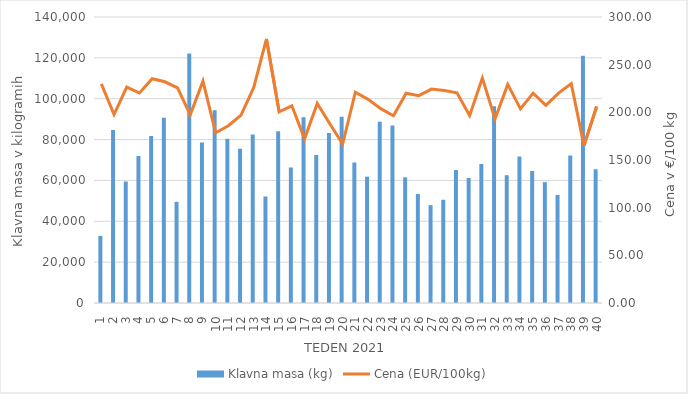
| Category | Klavna masa (kg) |
|---|---|
| 1.0 | 32871 |
| 2.0 | 84639 |
| 3.0 | 59476 |
| 4.0 | 72013 |
| 5.0 | 81759 |
| 6.0 | 90669 |
| 7.0 | 49517 |
| 8.0 | 122111 |
| 9.0 | 78545 |
| 10.0 | 94384 |
| 11.0 | 80405 |
| 12.0 | 75534 |
| 13.0 | 82440 |
| 14.0 | 52143 |
| 15.0 | 84105 |
| 16.0 | 66298 |
| 17.0 | 90925 |
| 18.0 | 72394 |
| 19.0 | 83193 |
| 20.0 | 91231 |
| 21.0 | 68763 |
| 22.0 | 61837 |
| 23.0 | 88747 |
| 24.0 | 86888 |
| 25.0 | 61507 |
| 26.0 | 53379 |
| 27.0 | 47910 |
| 28.0 | 50529 |
| 29.0 | 65062 |
| 30.0 | 61178 |
| 31.0 | 67992 |
| 32.0 | 96308 |
| 33.0 | 62558 |
| 34.0 | 71729 |
| 35.0 | 64596 |
| 36.0 | 59160 |
| 37.0 | 52905 |
| 38.0 | 72159 |
| 39.0 | 121060 |
| 40.0 | 65445 |